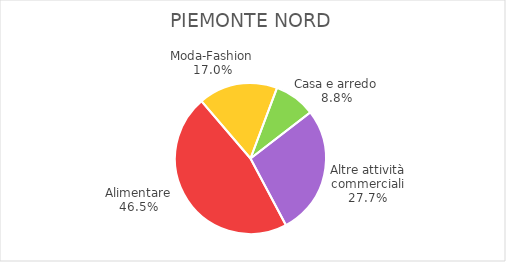
| Category | Piemonte Nord |
|---|---|
| Alimentare | 1743 |
| Moda-Fashion | 636 |
| Casa e arredo | 331 |
| Altre attività commerciali | 1037 |